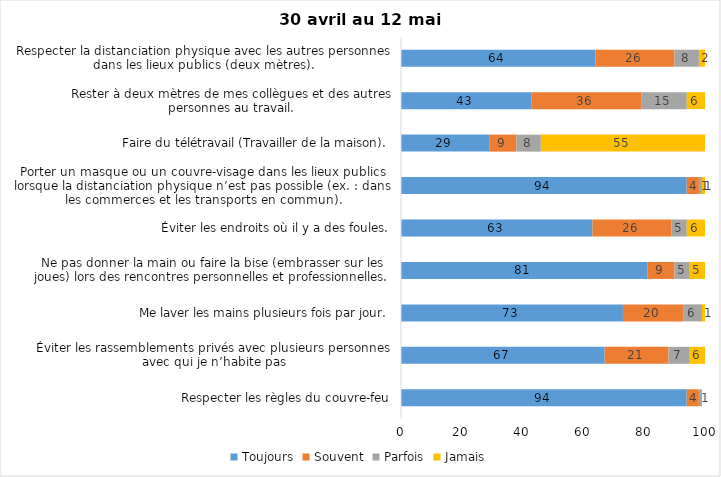
| Category | Toujours | Souvent | Parfois | Jamais |
|---|---|---|---|---|
| Respecter les règles du couvre-feu | 94 | 4 | 1 | 0 |
| Éviter les rassemblements privés avec plusieurs personnes avec qui je n’habite pas | 67 | 21 | 7 | 6 |
| Me laver les mains plusieurs fois par jour. | 73 | 20 | 6 | 1 |
| Ne pas donner la main ou faire la bise (embrasser sur les joues) lors des rencontres personnelles et professionnelles. | 81 | 9 | 5 | 5 |
| Éviter les endroits où il y a des foules. | 63 | 26 | 5 | 6 |
| Porter un masque ou un couvre-visage dans les lieux publics lorsque la distanciation physique n’est pas possible (ex. : dans les commerces et les transports en commun). | 94 | 4 | 1 | 1 |
| Faire du télétravail (Travailler de la maison). | 29 | 9 | 8 | 55 |
| Rester à deux mètres de mes collègues et des autres personnes au travail. | 43 | 36 | 15 | 6 |
| Respecter la distanciation physique avec les autres personnes dans les lieux publics (deux mètres). | 64 | 26 | 8 | 2 |